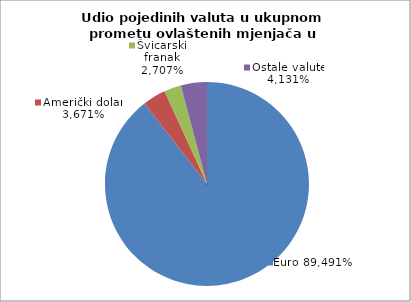
| Category | EUR |
|---|---|
| 0 | 0.895 |
| 1 | 0.037 |
| 2 | 0.027 |
| 3 | 0.041 |